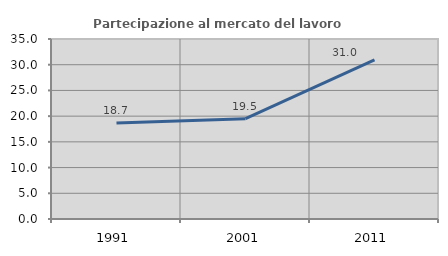
| Category | Partecipazione al mercato del lavoro  femminile |
|---|---|
| 1991.0 | 18.678 |
| 2001.0 | 19.497 |
| 2011.0 | 30.961 |